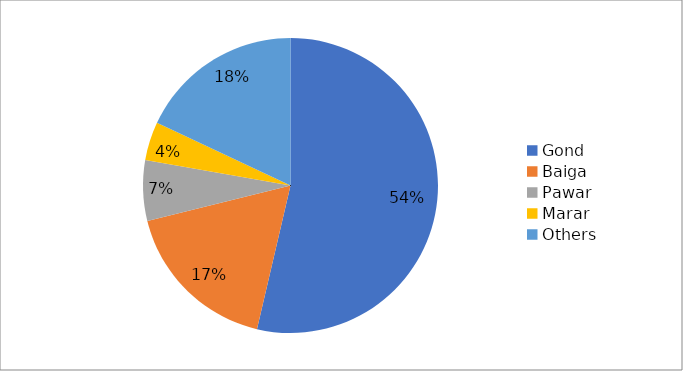
| Category | Series 0 |
|---|---|
| Gond | 53.614 |
| Baiga | 17.47 |
| Pawar | 6.627 |
| Marar | 4.217 |
| Others | 18 |